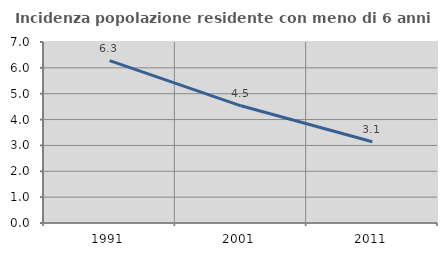
| Category | Incidenza popolazione residente con meno di 6 anni |
|---|---|
| 1991.0 | 6.278 |
| 2001.0 | 4.532 |
| 2011.0 | 3.14 |